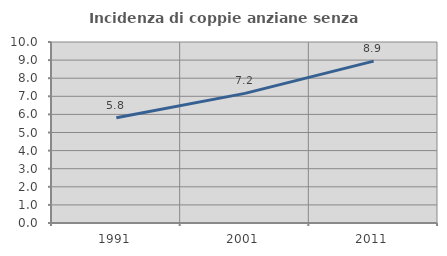
| Category | Incidenza di coppie anziane senza figli  |
|---|---|
| 1991.0 | 5.816 |
| 2001.0 | 7.162 |
| 2011.0 | 8.944 |